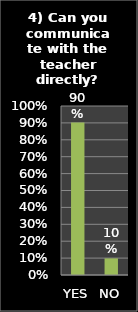
| Category | Series 0 |
|---|---|
| YES | 0.902 |
| NO | 0.098 |